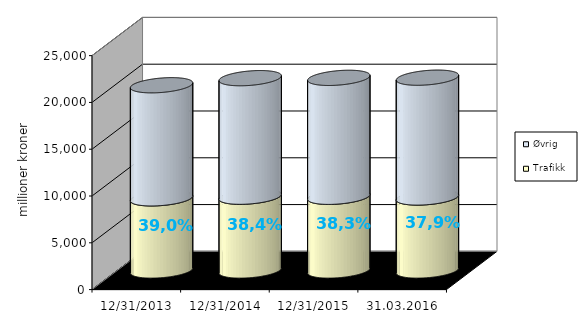
| Category | Trafikk | Øvrig |
|---|---|---|
| 31.12.2013 | 7709.892 | 12083.527 |
| 31.12.2014 | 7884.668 | 12665.925 |
| 31.12.2015 | 7875.825 | 12707.863 |
| 31.03.2016 | 7801.41 | 12801.395 |